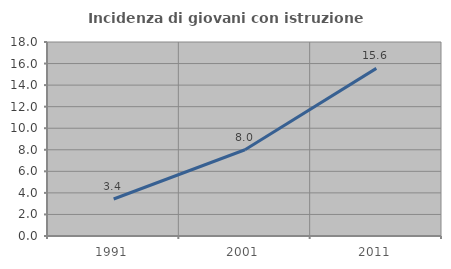
| Category | Incidenza di giovani con istruzione universitaria |
|---|---|
| 1991.0 | 3.433 |
| 2001.0 | 8 |
| 2011.0 | 15.552 |